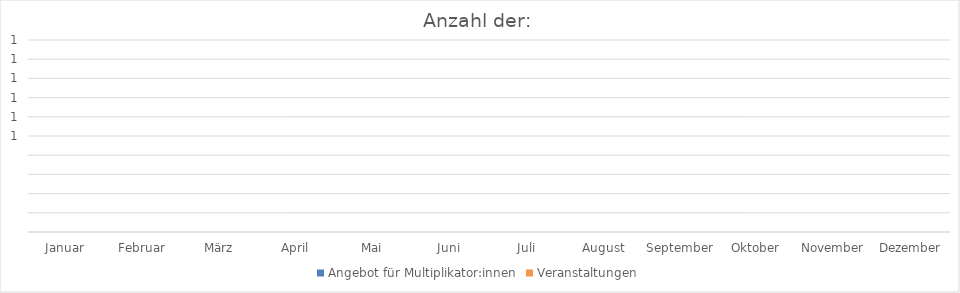
| Category | Angebot für Multiplikator:innen | Veranstaltungen |
|---|---|---|
| Januar | 0 | 0 |
| Februar | 0 | 0 |
| März | 0 | 0 |
| April | 0 | 0 |
| Mai | 0 | 0 |
| Juni | 0 | 0 |
| Juli | 0 | 0 |
| August | 0 | 0 |
| September | 0 | 0 |
| Oktober | 0 | 0 |
| November | 0 | 0 |
| Dezember | 0 | 0 |